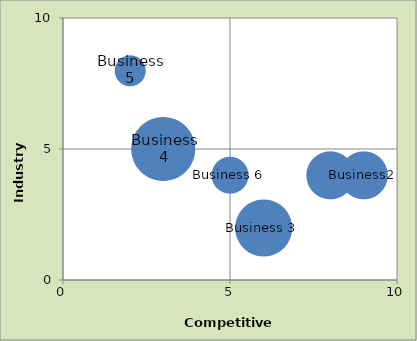
| Category | Series 0 |
|---|---|
| 8.0 | 4 |
| 9.0 | 4 |
| 6.0 | 2 |
| 3.0 | 5 |
| 2.0 | 8 |
| 5.0 | 4 |